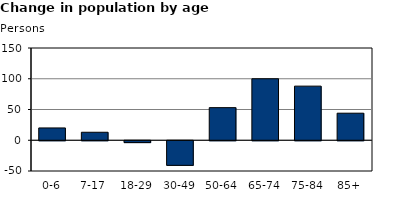
| Category | Series 2 |
|---|---|
| 0-6 | 20 |
| 7-17 | 13 |
| 18-29 | -3 |
| 30-49 | -40 |
| 50-64 | 53 |
| 65-74 | 100 |
| 75-84 | 88 |
| 85+ | 44 |